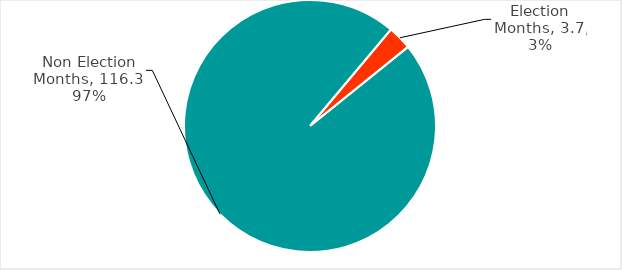
| Category | Total Grants |
|---|---|
| Election Months | 3.697 |
| Non Election Months | 116.266 |